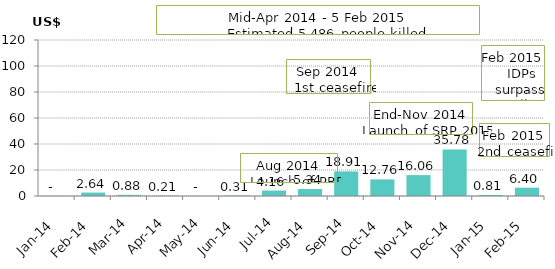
| Category | Committed/contributed in US$millions |
|---|---|
| 2014-01-01 | 0 |
| 2014-02-01 | 2.64 |
| 2014-03-01 | 0.884 |
| 2014-04-01 | 0.213 |
| 2014-05-01 | 0 |
| 2014-06-01 | 0.314 |
| 2014-07-01 | 4.163 |
| 2014-08-01 | 5.345 |
| 2014-09-01 | 18.907 |
| 2014-10-01 | 12.76 |
| 2014-11-01 | 16.06 |
| 2014-12-01 | 35.779 |
| 2015-01-01 | 0.806 |
| 2015-02-01 | 6.396 |